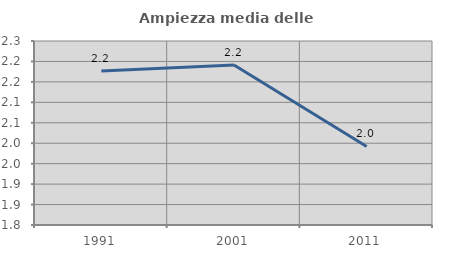
| Category | Ampiezza media delle famiglie |
|---|---|
| 1991.0 | 2.177 |
| 2001.0 | 2.191 |
| 2011.0 | 1.992 |